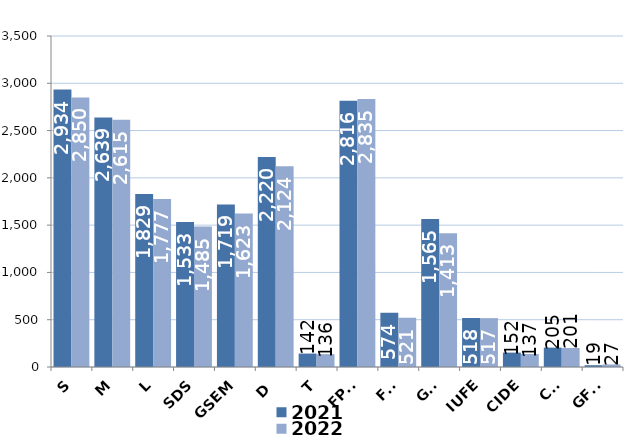
| Category | 2021 | 2022 |
|---|---|---|
| S | 2934 | 2850 |
| M | 2639 | 2615 |
| L | 1829 | 1777 |
| SDS | 1533 | 1485 |
| GSEM | 1719 | 1623 |
| D | 2220 | 2124 |
| T | 142 | 136 |
| FPSE | 2816 | 2835 |
| FTI | 574 | 521 |
| GSI | 1565 | 1413 |
| IUFE | 518 | 517 |
| CIDE | 152 | 137 |
| CUI | 205 | 201 |
| GFRI | 19 | 27 |